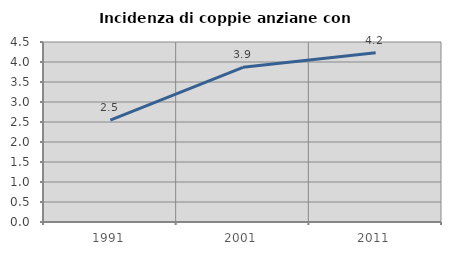
| Category | Incidenza di coppie anziane con figli |
|---|---|
| 1991.0 | 2.548 |
| 2001.0 | 3.867 |
| 2011.0 | 4.233 |